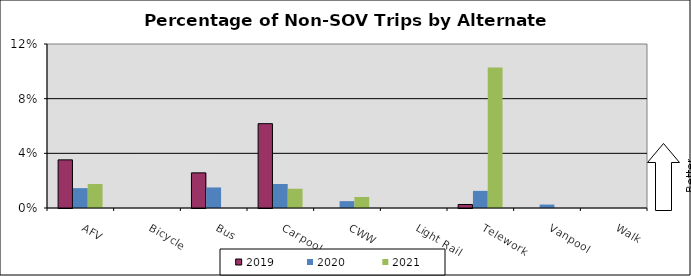
| Category | 2019 | 2020 | 2021 |
|---|---|---|---|
| AFV | 0.035 | 0.015 | 0.018 |
| Bicycle | 0 | 0 | 0 |
| Bus | 0.026 | 0.015 | 0 |
| Carpool | 0.062 | 0.018 | 0.014 |
| CWW | 0 | 0.005 | 0.008 |
| Light Rail | 0 | 0 | 0 |
| Telework | 0.003 | 0.013 | 0.103 |
| Vanpool | 0 | 0.003 | 0 |
| Walk | 0 | 0 | 0 |